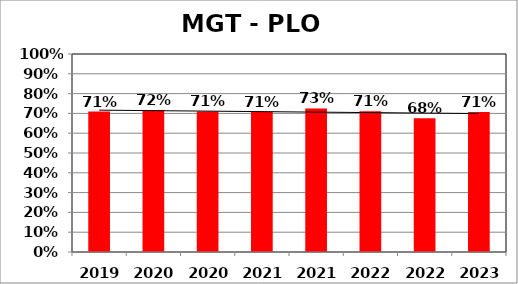
| Category | Series 0 |
|---|---|
| 2019 F | 0.709 |
| 2020 W | 0.717 |
| 2020 F | 0.71 |
| 2021 W | 0.708 |
| 2021 F | 0.725 |
| 2022 W | 0.711 |
| 2022 F | 0.675 |
| 2023 W | 0.707 |